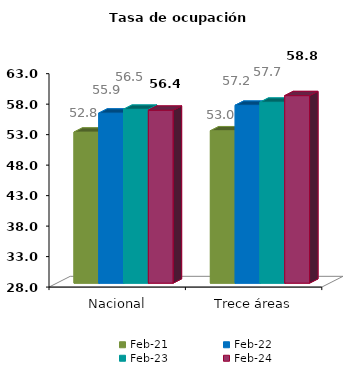
| Category | feb-21 | feb-22 | feb-23 | feb-24 |
|---|---|---|---|---|
| Nacional | 52.771 | 55.884 | 56.517 | 56.363 |
| Trece áreas | 52.99 | 57.176 | 57.676 | 58.756 |